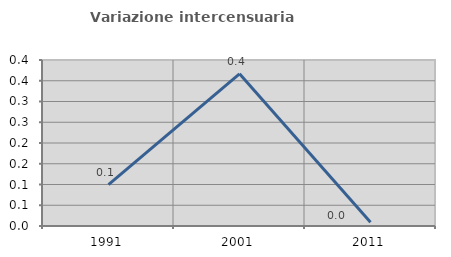
| Category | Variazione intercensuaria annua |
|---|---|
| 1991.0 | 0.1 |
| 2001.0 | 0.367 |
| 2011.0 | 0.009 |